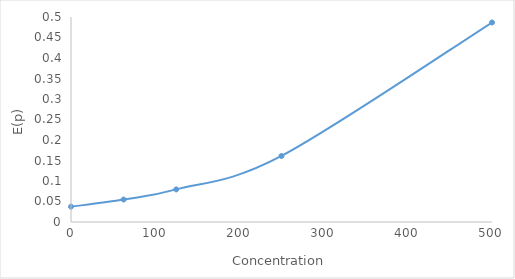
| Category | E(p) |
|---|---|
| 0.0 | 0.037 |
| 62.5 | 0.055 |
| 125.0 | 0.079 |
| 250.0 | 0.161 |
| 500.0 | 0.487 |